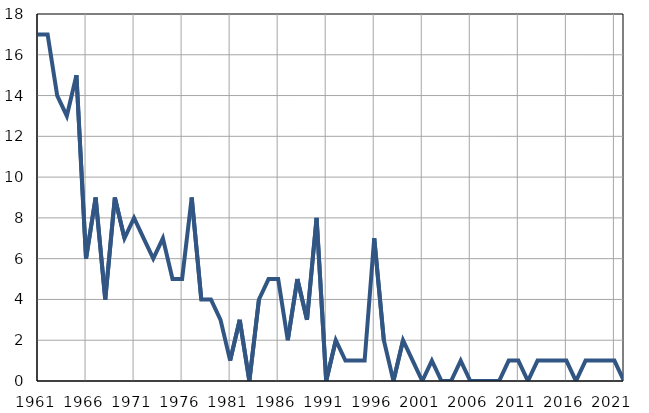
| Category | Infants
deaths |
|---|---|
| 1961.0 | 17 |
| 1962.0 | 17 |
| 1963.0 | 14 |
| 1964.0 | 13 |
| 1965.0 | 15 |
| 1966.0 | 6 |
| 1967.0 | 9 |
| 1968.0 | 4 |
| 1969.0 | 9 |
| 1970.0 | 7 |
| 1971.0 | 8 |
| 1972.0 | 7 |
| 1973.0 | 6 |
| 1974.0 | 7 |
| 1975.0 | 5 |
| 1976.0 | 5 |
| 1977.0 | 9 |
| 1978.0 | 4 |
| 1979.0 | 4 |
| 1980.0 | 3 |
| 1981.0 | 1 |
| 1982.0 | 3 |
| 1983.0 | 0 |
| 1984.0 | 4 |
| 1985.0 | 5 |
| 1986.0 | 5 |
| 1987.0 | 2 |
| 1988.0 | 5 |
| 1989.0 | 3 |
| 1990.0 | 8 |
| 1991.0 | 0 |
| 1992.0 | 2 |
| 1993.0 | 1 |
| 1994.0 | 1 |
| 1995.0 | 1 |
| 1996.0 | 7 |
| 1997.0 | 2 |
| 1998.0 | 0 |
| 1999.0 | 2 |
| 2000.0 | 1 |
| 2001.0 | 0 |
| 2002.0 | 1 |
| 2003.0 | 0 |
| 2004.0 | 0 |
| 2005.0 | 1 |
| 2006.0 | 0 |
| 2007.0 | 0 |
| 2008.0 | 0 |
| 2009.0 | 0 |
| 2010.0 | 1 |
| 2011.0 | 1 |
| 2012.0 | 0 |
| 2013.0 | 1 |
| 2014.0 | 1 |
| 2015.0 | 1 |
| 2016.0 | 1 |
| 2017.0 | 0 |
| 2018.0 | 1 |
| 2019.0 | 1 |
| 2020.0 | 1 |
| 2021.0 | 1 |
| 2022.0 | 0 |